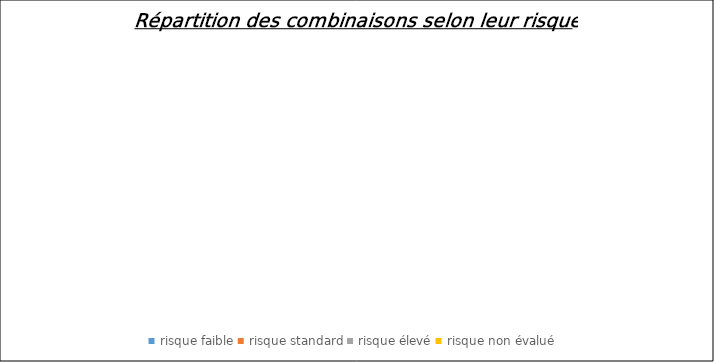
| Category | Series 0 |
|---|---|
| risque faible | 0 |
| risque standard | 0 |
| risque élevé | 0 |
| risque non évalué | 0 |